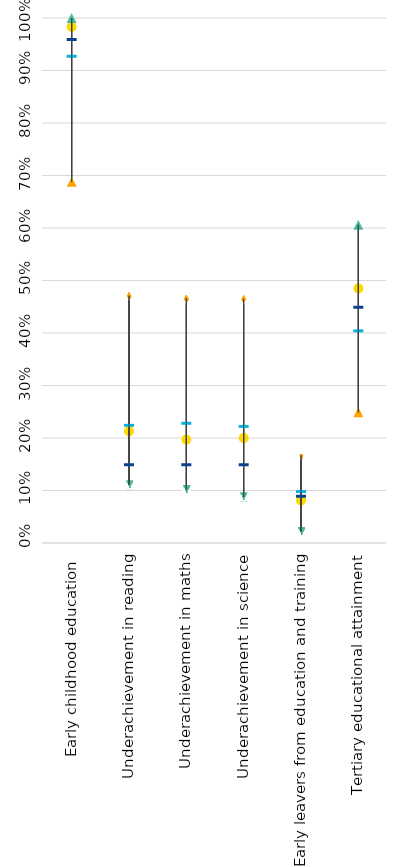
| Category | Belgium | Strongest performer | Weakest performer | EU average | EU target |
|---|---|---|---|---|---|
| Early childhood education  | 0.983 | 1 | 0.688 | 0.928 | 0.96 |
| Underachievement in reading | 0.213 | 0.111 | 0.471 | 0.225 | 0.15 |
| Underachievement in maths | 0.197 | 0.102 | 0.466 | 0.229 | 0.15 |
| Underachievement in science | 0.2 | 0.088 | 0.465 | 0.223 | 0.15 |
| Early leavers from education and training | 0.081 | 0.022 | 0.167 | 0.099 | 0.09 |
| Tertiary educational attainment | 0.485 | 0.606 | 0.249 | 0.405 | 0.45 |